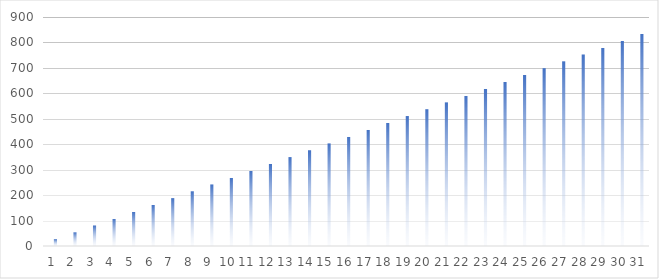
| Category | Wörter | Ziel |
|---|---|---|
| 0 |  | 26.882 |
| 1 |  | 53.763 |
| 2 |  | 80.645 |
| 3 |  | 107.527 |
| 4 |  | 134.409 |
| 5 |  | 161.29 |
| 6 |  | 188.172 |
| 7 |  | 215.054 |
| 8 |  | 241.935 |
| 9 |  | 268.817 |
| 10 |  | 295.699 |
| 11 |  | 322.581 |
| 12 |  | 349.462 |
| 13 |  | 376.344 |
| 14 |  | 403.226 |
| 15 |  | 430.108 |
| 16 |  | 456.989 |
| 17 |  | 483.871 |
| 18 |  | 510.753 |
| 19 |  | 537.634 |
| 20 |  | 564.516 |
| 21 |  | 591.398 |
| 22 |  | 618.28 |
| 23 |  | 645.161 |
| 24 |  | 672.043 |
| 25 |  | 698.925 |
| 26 |  | 725.806 |
| 27 |  | 752.688 |
| 28 |  | 779.57 |
| 29 |  | 806.452 |
| 30 |  | 833.333 |